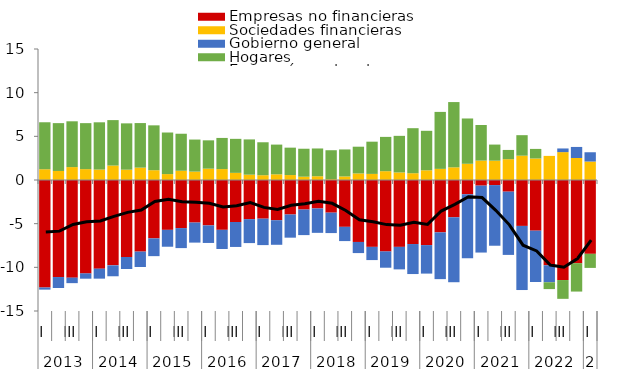
| Category | Empresas no financieras | Sociedades financieras | Gobierno general | Hogares |
|---|---|---|---|---|
| 0 | -12.307 | 1.231 | -0.246 | 5.38 |
| 1 | -11.111 | 1.034 | -1.257 | 5.478 |
| 2 | -11.181 | 1.479 | -0.628 | 5.243 |
| 3 | -10.693 | 1.243 | -0.608 | 5.267 |
| 4 | -10.152 | 1.197 | -1.143 | 5.41 |
| 5 | -9.773 | 1.655 | -1.25 | 5.203 |
| 6 | -8.814 | 1.183 | -1.377 | 5.303 |
| 7 | -8.2 | 1.417 | -1.764 | 5.102 |
| 8 | -6.685 | 1.121 | -2.033 | 5.138 |
| 9 | -5.708 | 0.677 | -1.933 | 4.761 |
| 10 | -5.507 | 1.058 | -2.29 | 4.239 |
| 11 | -4.874 | 0.959 | -2.295 | 3.672 |
| 12 | -5.198 | 1.299 | -2.01 | 3.243 |
| 13 | -5.706 | 1.25 | -2.193 | 3.566 |
| 14 | -4.809 | 0.818 | -2.858 | 3.894 |
| 15 | -4.482 | 0.611 | -2.742 | 4.036 |
| 16 | -4.428 | 0.547 | -3.026 | 3.774 |
| 17 | -4.606 | 0.651 | -2.813 | 3.404 |
| 18 | -3.952 | 0.566 | -2.651 | 3.138 |
| 19 | -3.384 | 0.38 | -2.925 | 3.201 |
| 20 | -3.257 | 0.429 | -2.795 | 3.18 |
| 21 | -3.74 | 0.106 | -2.338 | 3.303 |
| 22 | -5.364 | 0.406 | -1.631 | 3.093 |
| 23 | -7.095 | 0.753 | -1.273 | 3.06 |
| 24 | -7.657 | 0.698 | -1.512 | 3.69 |
| 25 | -8.177 | 1.009 | -1.868 | 3.928 |
| 26 | -7.657 | 0.866 | -2.578 | 4.189 |
| 27 | -7.332 | 0.776 | -3.437 | 5.156 |
| 28 | -7.453 | 1.11 | -3.265 | 4.523 |
| 29 | -5.997 | 1.275 | -5.355 | 6.523 |
| 30 | -4.27 | 1.451 | -7.436 | 7.472 |
| 31 | -1.633 | 1.857 | -7.335 | 5.187 |
| 32 | -0.646 | 2.221 | -7.662 | 4.076 |
| 33 | -0.585 | 2.212 | -6.942 | 1.845 |
| 34 | -1.336 | 2.384 | -7.242 | 1.059 |
| 35 | -5.258 | 2.786 | -7.341 | 2.348 |
| 36 | -5.803 | 2.463 | -5.879 | 1.097 |
| 37 | -9.766 | 2.76 | -1.945 | -0.781 |
| 38 | -11.455 | 3.193 | 0.418 | -2.152 |
| 39 | -9.524 | 2.521 | 1.263 | -3.251 |
| 40 | -8.453 | 2.115 | 1.062 | -1.613 |